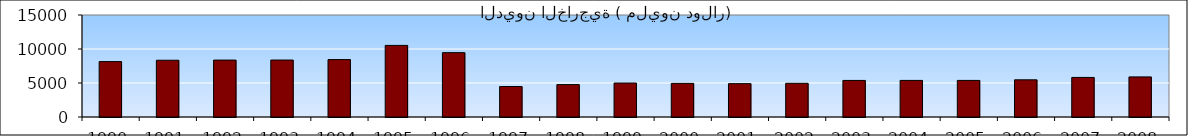
| Category | الديون الخارجية ( مليون دولار) |
|---|---|
| 1990.0 | 8150 |
| 1991.0 | 8345.7 |
| 1992.0 | 8369.3 |
| 1993.0 | 8376.3 |
| 1994.0 | 8442.8 |
| 1995.0 | 10530 |
| 1996.0 | 9463.2 |
| 1997.0 | 4482.7 |
| 1998.0 | 4764.6 |
| 1999.0 | 4995.3 |
| 2000.0 | 4943.5 |
| 2001.0 | 4904.2 |
| 2002.0 | 4955.3 |
| 2003.0 | 5378.3 |
| 2004.0 | 5381.4 |
| 2005.0 | 5381.4 |
| 2006.0 | 5470.3 |
| 2007.0 | 5819 |
| 2008.0 | 5894 |